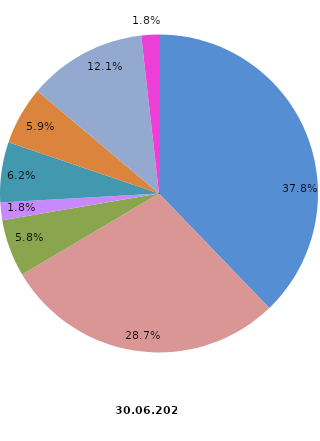
| Category | Anzahl Beschäftigte 2021 |
|---|---|
| Elektroinstallation | 5871 |
| Gas-, Wasser-, Heizungs- sowie Lüftungs- und Klimainstallation | 4458 |
| Sonstige Bauinstallation | 903 |
| Anbringen von Stuckaturen, Gipserei und Verputzerei | 275 |
| Bautischlerei und -schlosserei | 953 |
| Fußboden-, Fliesen- und Plattenlegerei, Tapeziererei | 920 |
| Malerei und Glaserei | 1874 |
| Sonstiger Ausbau a. n. g. | 277 |